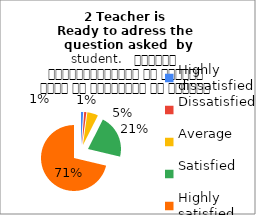
| Category | 2 Teacher is 
Ready to adress the  question asked  by student.   शिक्षक विद्यार्थियों के द्वारा पूछे गए प्रश्नों का समाधान करने हेतु तत्पर रहते हैं |
|---|---|
| Highly dissatisfied | 1 |
| Dissatisfied | 1 |
| Average | 5 |
| Satisfied | 20 |
| Highly satisfied | 67 |